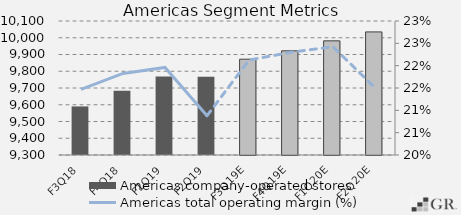
| Category | Americas company-operated stores |
|---|---|
|  F3Q18  | 9590 |
|  F4Q18  | 9684 |
|  F1Q19  | 9768 |
|  F2Q19  | 9767 |
|  F3Q19E  | 9872 |
|  F4Q19E  | 9922 |
|  F1Q20E  | 9981.5 |
|  F2Q20E  | 10034.875 |